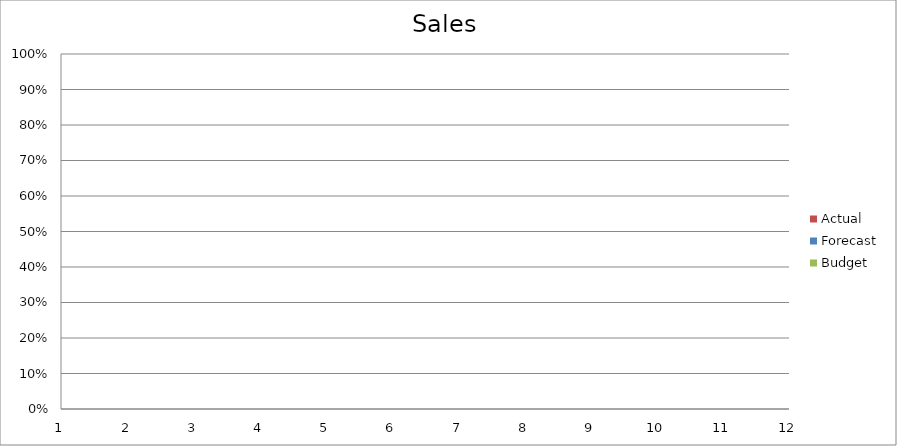
| Category | Budget | Forecast | Actual |
|---|---|---|---|
| 0 | 2930 | 2120 | 670 |
| 1 | 1590 | 2780 | 1880 |
| 2 | 1500 | 3310 | 760 |
| 3 | 1590 | 2210 | 2460 |
| 4 | 1010 | 550 | 3500 |
| 5 | 2820 | 1950 | 1370 |
| 6 | 2070 | 650 | 530 |
| 7 | 1160 | 1900 | 2510 |
| 8 | 3470 | 1010 | 2560 |
| 9 | 2980 | 3190 | 2160 |
| 10 | 1290 | 1050 | 1880 |
| 11 | 1840 | 1730 | 860 |